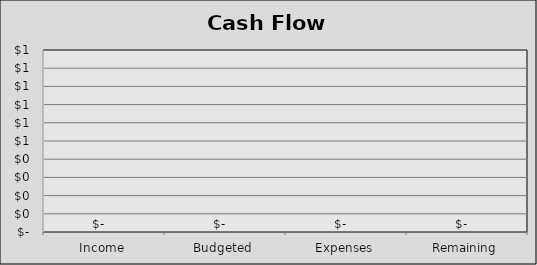
| Category | Series 1 |
|---|---|
| Income | 0 |
| Budgeted | 0 |
| Expenses | 0 |
| Remaining | 0 |